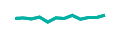
| Category | Series 1 | Series 0 |
|---|---|---|
| 0 | 428 | 428 |
| 1 | 451 | 451 |
| 2 | 403 | 403 |
| 3 | 496 | 496 |
| 4 | 244 | 244 |
| 5 | 459 | 459 |
| 6 | 422 | 422 |
| 7 | 582 | 582 |
| 8 | 387 | 387 |
| 9 | 477 | 477 |
| 10 | 475 | 475 |
| 11 | 591 | 591 |